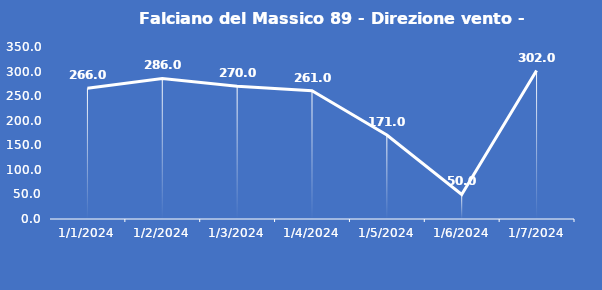
| Category | Falciano del Massico 89 - Direzione vento - Grezzo (°N) |
|---|---|
| 1/1/24 | 266 |
| 1/2/24 | 286 |
| 1/3/24 | 270 |
| 1/4/24 | 261 |
| 1/5/24 | 171 |
| 1/6/24 | 50 |
| 1/7/24 | 302 |